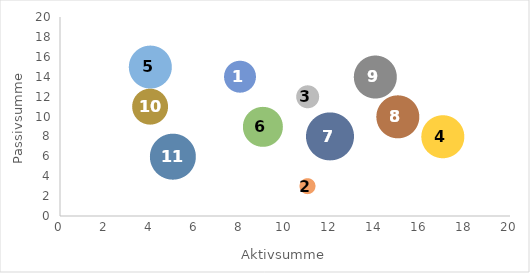
| Category | Series 0 |
|---|---|
| 8.0 | 14 |
| 11.0 | 3 |
| 11.0 | 12 |
| 17.0 | 8 |
| 4.0 | 15 |
| 9.0 | 9 |
| 12.0 | 8 |
| 15.0 | 10 |
| 14.0 | 14 |
| 4.0 | 11 |
| 5.0 | 6 |